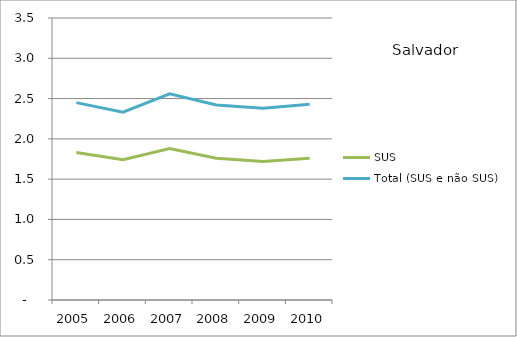
| Category | SUS | Total (SUS e não SUS) |
|---|---|---|
| 2005.0 | 1.83 | 2.45 |
| 2006.0 | 1.74 | 2.33 |
| 2007.0 | 1.88 | 2.56 |
| 2008.0 | 1.76 | 2.42 |
| 2009.0 | 1.72 | 2.38 |
| 2010.0 | 1.76 | 2.43 |